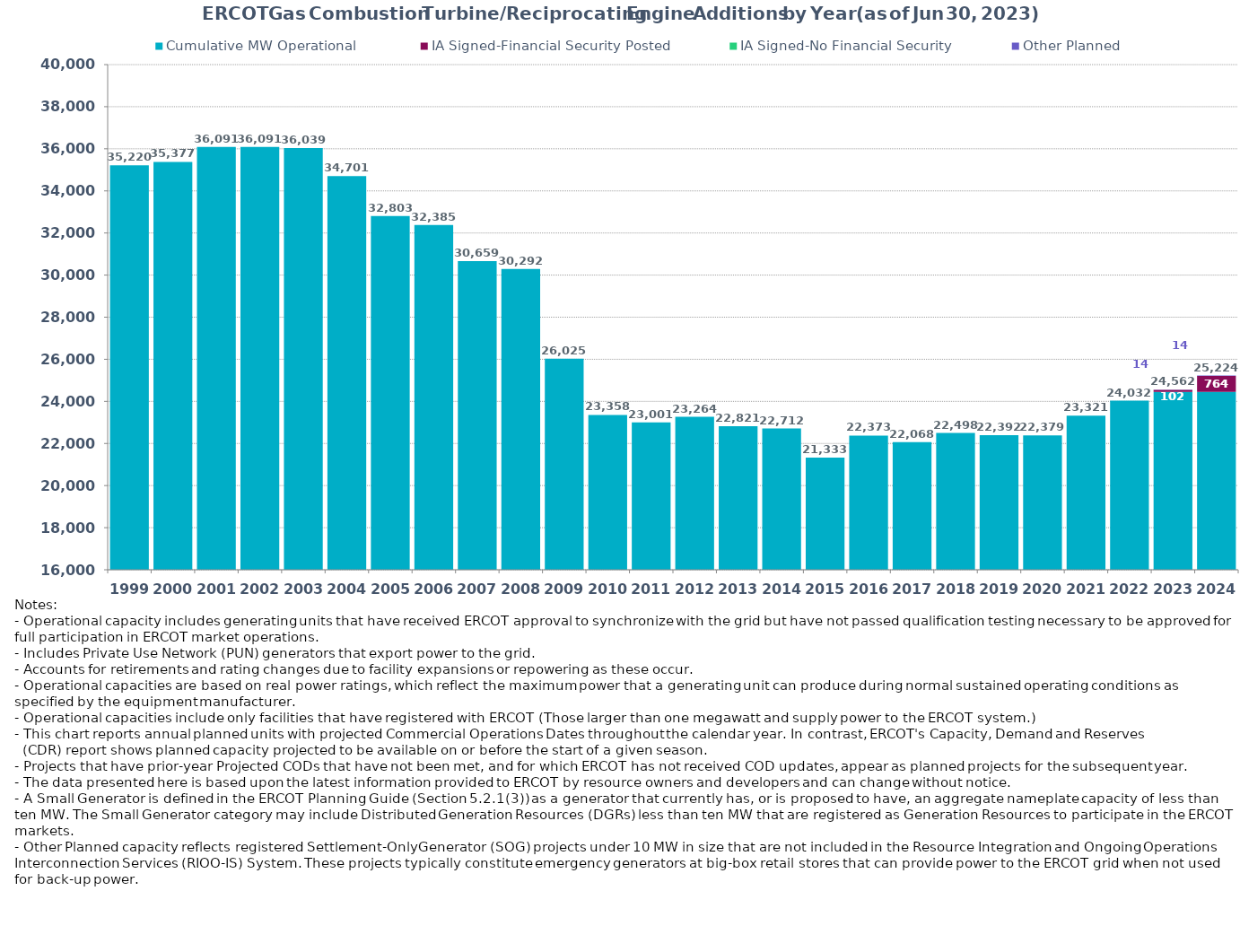
| Category | Cumulative MW Operational  | IA Signed-Financial Security Posted  | IA Signed-No Financial Security  | Other Planned | Cumulative Installed and Planned |
|---|---|---|---|---|---|
| 1999.0 | 35219.87 | 0 | 0 | 0 | 35219.87 |
| 2000.0 | 35377.48 | 0 | 0 | 0 | 35377.48 |
| 2001.0 | 36091.14 | 0 | 0 | 0 | 36091.14 |
| 2002.0 | 36091.14 | 0 | 0 | 0 | 36091.14 |
| 2003.0 | 36039.14 | 0 | 0 | 0 | 36039.14 |
| 2004.0 | 34701.24 | 0 | 0 | 0 | 34701.24 |
| 2005.0 | 32803.04 | 0 | 0 | 0 | 32803.04 |
| 2006.0 | 32385.14 | 0 | 0 | 0 | 32385.14 |
| 2007.0 | 30659.14 | 0 | 0 | 0 | 30659.14 |
| 2008.0 | 30291.94 | 0 | 0 | 0 | 30291.94 |
| 2009.0 | 26025.17 | 0 | 0 | 0 | 26025.17 |
| 2010.0 | 23358.05 | 0 | 0 | 0 | 23358.05 |
| 2011.0 | 23001.35 | 0 | 0 | 0 | 23001.35 |
| 2012.0 | 23263.55 | 0 | 0 | 0 | 23263.55 |
| 2013.0 | 22820.71 | 0 | 0 | 0 | 22820.71 |
| 2014.0 | 22711.71 | 0 | 0 | 0 | 22711.71 |
| 2015.0 | 21332.91 | 0 | 0 | 0 | 21332.91 |
| 2016.0 | 22373.29 | 0 | 0 | 0 | 22373.29 |
| 2017.0 | 22068.43 | 0 | 0 | 0 | 22068.43 |
| 2018.0 | 22497.59 | 0 | 0 | 0 | 22497.59 |
| 2019.0 | 22392.29 | 0 | 0 | 0 | 22392.29 |
| 2020.0 | 22379.29 | 0 | 0 | 0 | 22379.29 |
| 2021.0 | 23321.49 | 0 | 0 | 0 | 23321.49 |
| 2022.0 | 24031.64 | 0 | 0 | 0 | 24031.64 |
| 2023.0 | 24446.29 | 102 | 0 | 13.95 | 24562.24 |
| 2024.0 | 24446.29 | 764 | 0 | 13.95 | 25224.24 |